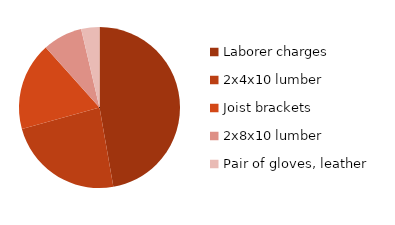
| Category | Series 0 |
|---|---|
| Laborer charges | 200 |
| 2x4x10 lumber | 99.4 |
| Joist brackets | 74.7 |
| 2x8x10 lumber | 33.75 |
| Pair of gloves, leather | 15.5 |